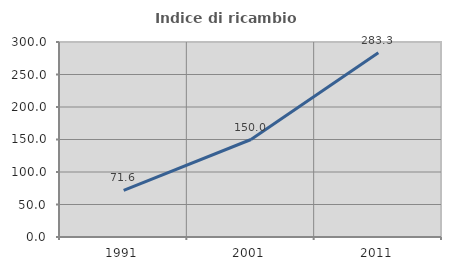
| Category | Indice di ricambio occupazionale  |
|---|---|
| 1991.0 | 71.622 |
| 2001.0 | 150 |
| 2011.0 | 283.333 |